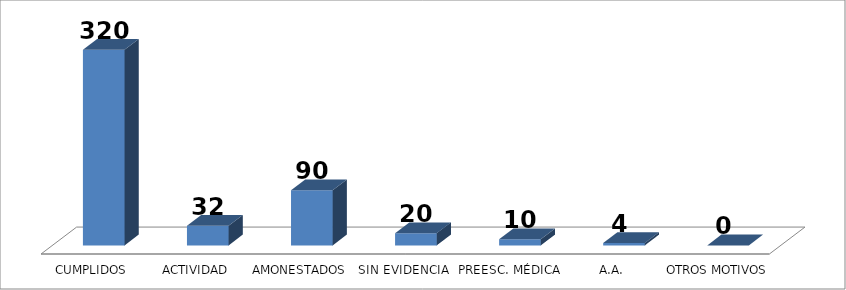
| Category | Series 0 |
|---|---|
| CUMPLIDOS | 320 |
| ACTIVIDAD | 32 |
| AMONESTADOS | 90 |
| SIN EVIDENCIA | 20 |
| PREESC. MÉDICA | 10 |
| A.A. | 4 |
| OTROS MOTIVOS | 0 |